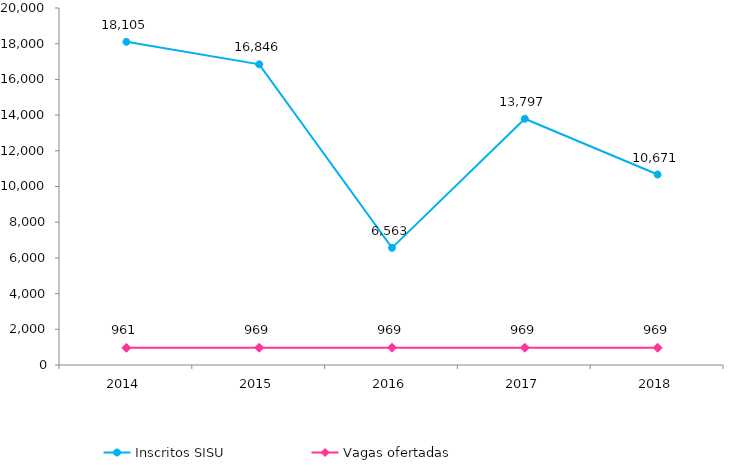
| Category | Inscritos SISU |
|---|---|
| 2014.0 | 18105 |
| 2015.0 | 16846 |
| 2016.0 | 6563 |
| 2017.0 | 13797 |
| 2018.0 | 10671 |